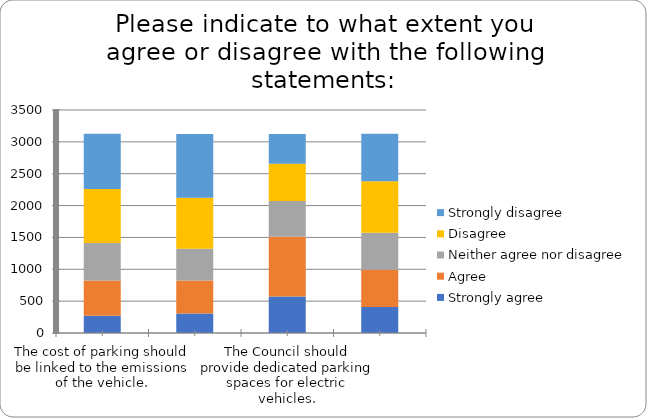
| Category | Strongly agree | Agree | Neither agree nor disagree | Disagree | Strongly disagree |
|---|---|---|---|---|---|
| The cost of parking should be linked to the emissions of the vehicle. | 272 | 552 | 587 | 849 | 868 |
| A surcharge on parking permits and parking fees for diesel vehicles should be introduced. | 305 | 519 | 498 | 799 | 1002 |
| The Council should provide dedicated parking spaces for electric vehicles. | 573 | 937 | 561 | 585 | 468 |
| There should be a discount on parking charges for electric vehicles. | 409 | 583 | 581 | 809 | 744 |